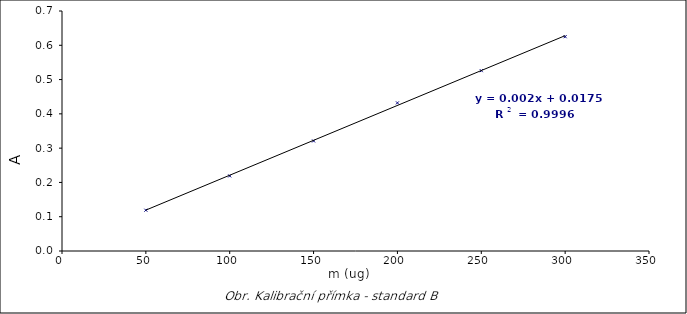
| Category | Series 0 |
|---|---|
| 50.0 | 0.119 |
| 100.0 | 0.219 |
| 150.0 | 0.321 |
| 200.0 | 0.432 |
| 250.0 | 0.526 |
| 300.0 | 0.625 |